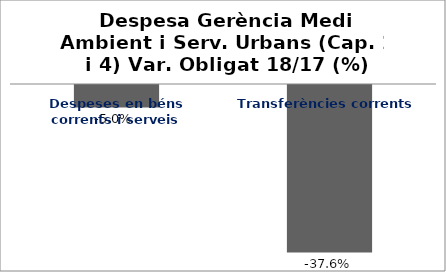
| Category | Series 0 |
|---|---|
| Despeses en béns corrents i serveis | -0.05 |
| Transferències corrents | -0.376 |